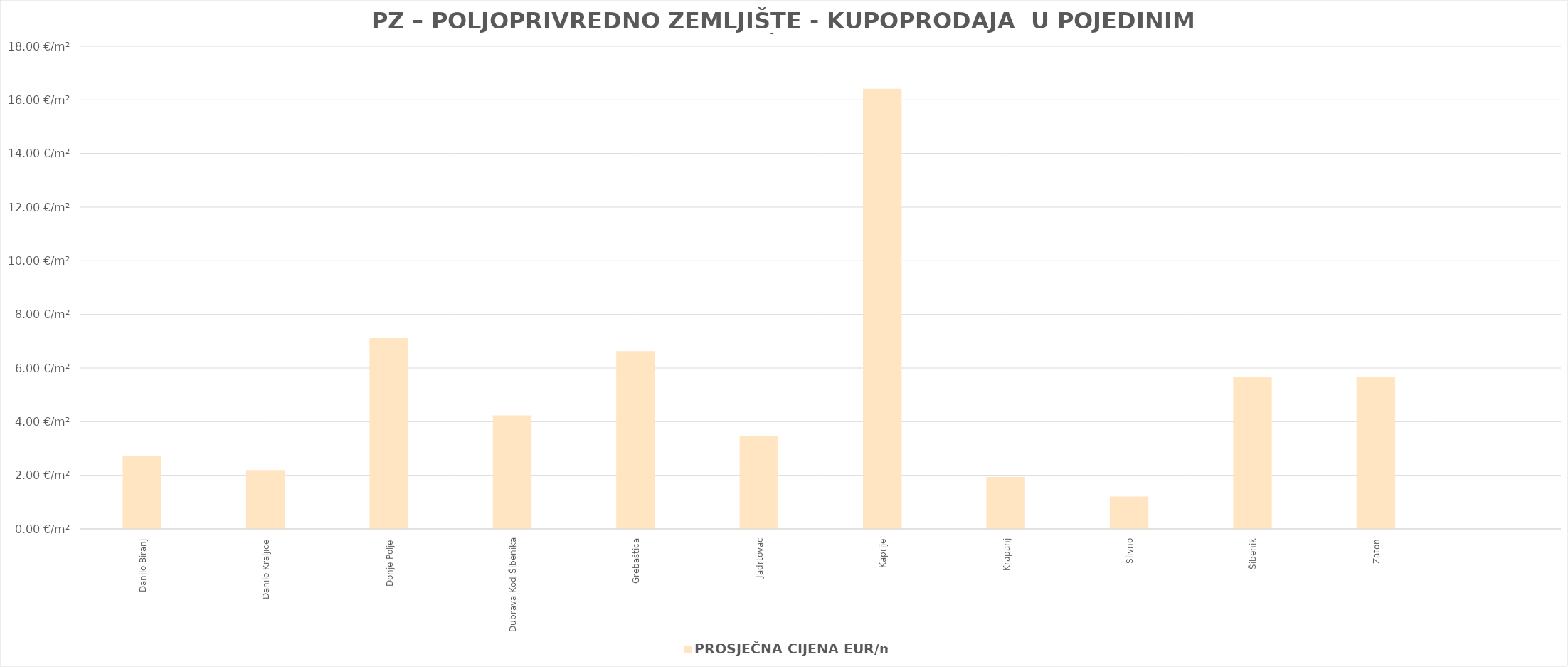
| Category | PROSJEČNA CIJENA EUR/m2 |
|---|---|
| Danilo Biranj | 1900-01-02 17:02:53 |
| Danilo Kraljice | 1900-01-02 04:38:52 |
| Donje Polje | 1900-01-07 02:42:05 |
| Dubrava Kod Šibenika | 1900-01-04 05:36:48 |
| Grebaštica | 1900-01-06 15:03:52 |
| Jadrtovac | 1900-01-03 11:27:56 |
| Kaprije | 1900-01-16 09:55:51 |
| Krapanj | 1900-01-01 22:28:14 |
| Slivno | 1900-01-01 05:03:17 |
| Šibenik | 1900-01-05 16:11:26 |
| Zaton | 1900-01-05 15:53:04 |